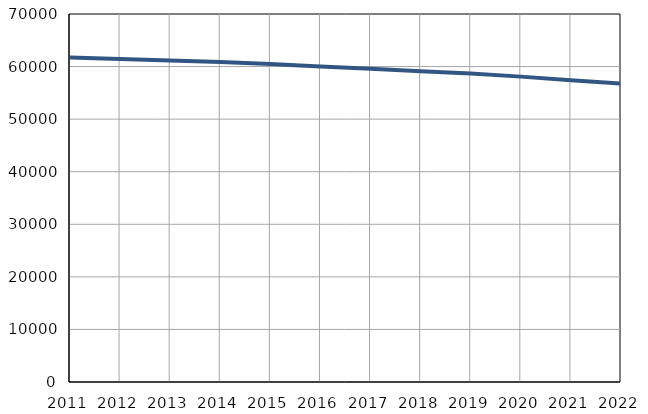
| Category | Population
size |
|---|---|
| 2011.0 | 61740 |
| 2012.0 | 61454 |
| 2013.0 | 61147 |
| 2014.0 | 60850 |
| 2015.0 | 60482 |
| 2016.0 | 60035 |
| 2017.0 | 59563 |
| 2018.0 | 59131 |
| 2019.0 | 58689 |
| 2020.0 | 58087 |
| 2021.0 | 57396 |
| 2022.0 | 56754 |